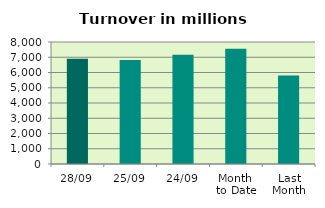
| Category | Series 0 |
|---|---|
| 28/09 | 6896.133 |
| 25/09 | 6822.515 |
| 24/09 | 7156.591 |
| Month 
to Date | 7559.324 |
| Last
Month | 5795.357 |